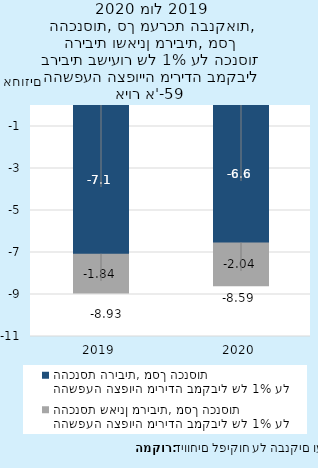
| Category | ההשפעה הצפויה מירידה במקביל של 1% על ההכנסת הריבית, מסך הכנסות | ההשפעה הצפויה מירידה במקביל של 1% על ההכנסת שאינן מריבית, מסך הכנסות |
|---|---|---|
| 2019-12-31 | -7.085 | -1.844 |
| 2020-12-31 | -6.55 | -2.037 |